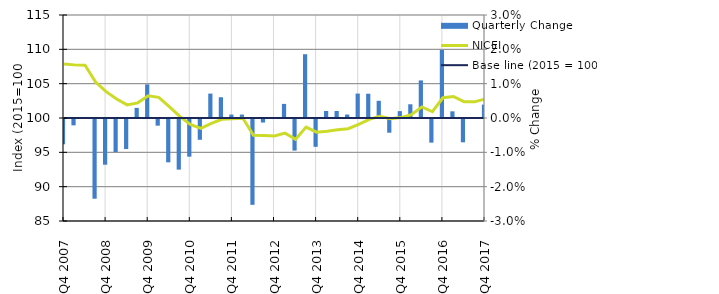
| Category | Quarterly Change |
|---|---|
| Q4 2007 | -0.007 |
|  | -0.002 |
|  | 0 |
|  | -0.023 |
| Q4 2008 | -0.013 |
|  | -0.01 |
|  | -0.009 |
|  | 0.003 |
| Q4 2009 | 0.01 |
|  | -0.002 |
|  | -0.013 |
|  | -0.015 |
| Q4 2010 | -0.011 |
|  | -0.006 |
|  | 0.007 |
|  | 0.006 |
| Q4 2011 | 0.001 |
|  | 0.001 |
|  | -0.025 |
|  | -0.001 |
| Q4 2012 | 0 |
|  | 0.004 |
|  | -0.009 |
|  | 0.019 |
| Q4 2013 | -0.008 |
|  | 0.002 |
|  | 0.002 |
|  | 0.001 |
| Q4 2014 | 0.007 |
|  | 0.007 |
|  | 0.005 |
|  | -0.004 |
| Q4 2015 | 0.002 |
|  | 0.004 |
|  | 0.011 |
|  | -0.007 |
| Q4 2016 | 0.02 |
|  | 0.002 |
|  | -0.007 |
|  | 0 |
| Q4 2017 | 0.004 |